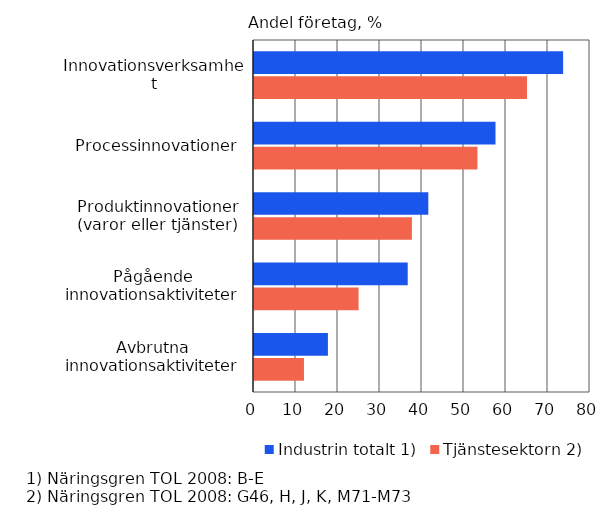
| Category | Industrin totalt 1) | Tjänstesektorn 2) |
|---|---|---|
| Innovationsverksamhet | 73.6 | 65 |
| Processinnovationer | 57.5 | 53.2 |
| Produktinnovationer (varor eller tjänster) | 41.5 | 37.6 |
| Pågående innovationsaktiviteter | 36.6 | 24.9 |
| Avbrutna innovationsaktiviteter | 17.6 | 11.9 |